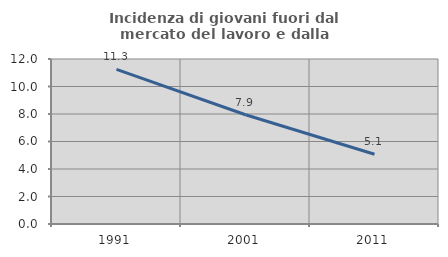
| Category | Incidenza di giovani fuori dal mercato del lavoro e dalla formazione  |
|---|---|
| 1991.0 | 11.25 |
| 2001.0 | 7.947 |
| 2011.0 | 5.072 |